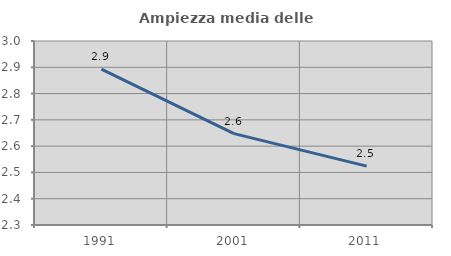
| Category | Ampiezza media delle famiglie |
|---|---|
| 1991.0 | 2.893 |
| 2001.0 | 2.648 |
| 2011.0 | 2.524 |